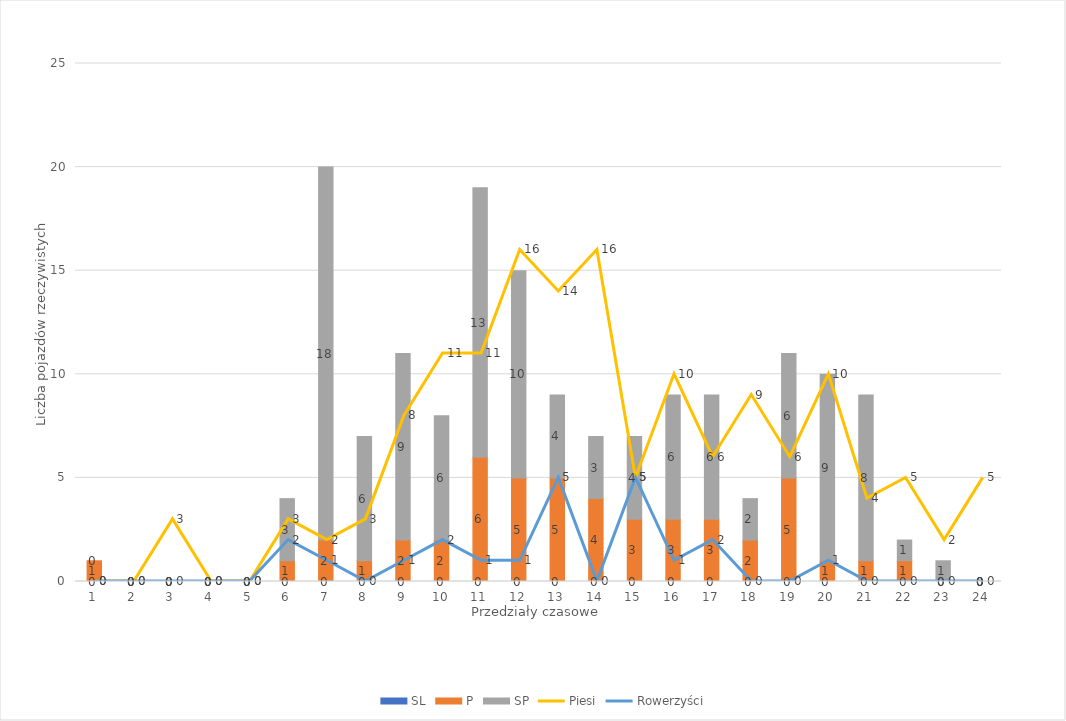
| Category | SL | P | SP |
|---|---|---|---|
| 0 | 0 | 1 | 0 |
| 1 | 0 | 0 | 0 |
| 2 | 0 | 0 | 0 |
| 3 | 0 | 0 | 0 |
| 4 | 0 | 0 | 0 |
| 5 | 0 | 1 | 3 |
| 6 | 0 | 2 | 18 |
| 7 | 0 | 1 | 6 |
| 8 | 0 | 2 | 9 |
| 9 | 0 | 2 | 6 |
| 10 | 0 | 6 | 13 |
| 11 | 0 | 5 | 10 |
| 12 | 0 | 5 | 4 |
| 13 | 0 | 4 | 3 |
| 14 | 0 | 3 | 4 |
| 15 | 0 | 3 | 6 |
| 16 | 0 | 3 | 6 |
| 17 | 0 | 2 | 2 |
| 18 | 0 | 5 | 6 |
| 19 | 0 | 1 | 9 |
| 20 | 0 | 1 | 8 |
| 21 | 0 | 1 | 1 |
| 22 | 0 | 0 | 1 |
| 23 | 0 | 0 | 0 |